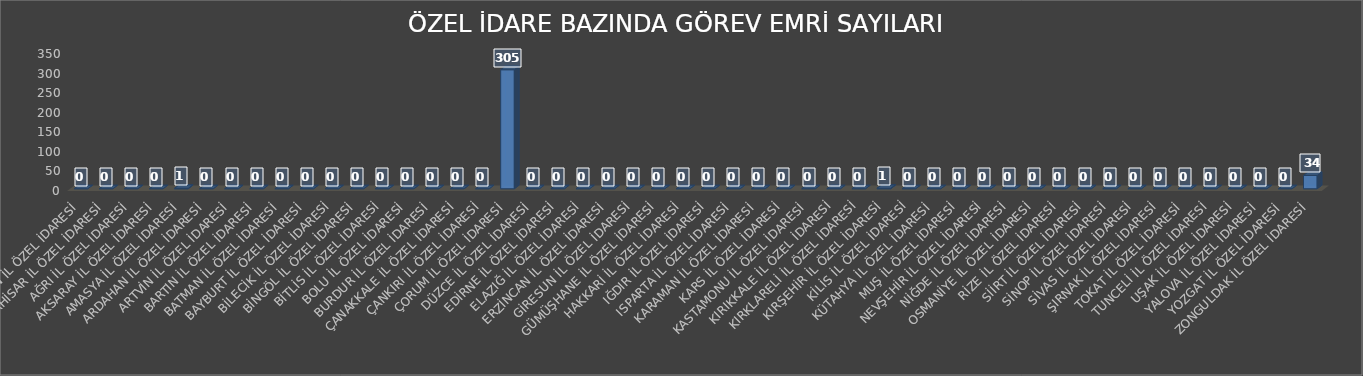
| Category | Series 0 |
|---|---|
| ADIYAMAN İL ÖZEL İDARESİ | 0 |
| AFYONKARAHİSAR İL ÖZEL İDARESİ | 0 |
| AĞRI İL ÖZEL İDARESİ | 0 |
| AKSARAY İL ÖZEL İDARESİ | 0 |
| AMASYA İL ÖZEL İDARESİ | 1 |
| ARDAHAN İL ÖZEL İDARESİ | 0 |
| ARTVİN İL ÖZEL İDARESİ | 0 |
| BARTIN İL ÖZEL İDARESİ | 0 |
| BATMAN İL ÖZEL İDARESİ | 0 |
| BAYBURT İL ÖZEL İDARESİ | 0 |
| BİLECİK İL ÖZEL İDARESİ | 0 |
| BİNGÖL İL ÖZEL İDARESİ | 0 |
| BİTLİS İL ÖZEL İDARESİ | 0 |
| BOLU İL ÖZEL İDARESİ | 0 |
| BURDUR İL ÖZEL İDARESİ | 0 |
| ÇANAKKALE İL ÖZEL İDARESİ | 0 |
| ÇANKIRI İL ÖZEL İDARESİ | 0 |
| ÇORUM İL ÖZEL İDARESİ | 305 |
| DÜZCE İL ÖZEL İDARESİ | 0 |
| EDİRNE İL ÖZEL İDARESİ | 0 |
| ELAZIĞ İL ÖZEL İDARESİ | 0 |
| ERZİNCAN İL ÖZEL İDARESİ | 0 |
| GİRESUN İL ÖZEL İDARESİ | 0 |
| GÜMÜŞHANE İL ÖZEL İDARESİ | 0 |
| HAKKARİ İL ÖZEL İDARESİ | 0 |
| IĞDIR İL ÖZEL İDARESİ | 0 |
| ISPARTA İL ÖZEL İDARESİ | 0 |
| KARAMAN İL ÖZEL İDARESİ | 0 |
| KARS İL ÖZEL İDARESİ | 0 |
| KASTAMONU İL ÖZEL İDARESİ | 0 |
| KIRIKKALE İL ÖZEL İDARESİ | 0 |
| KIRKLARELİ İL ÖZEL İDARESİ | 0 |
| KIRŞEHİR İL ÖZEL İDARESİ | 1 |
| KİLİS İL ÖZEL İDARESİ | 0 |
| KÜTAHYA İL ÖZEL İDARESİ | 0 |
| MUŞ İL ÖZEL İDARESİ | 0 |
| NEVŞEHİR İL ÖZEL İDARESİ | 0 |
| NİĞDE İL ÖZEL İDARESİ | 0 |
| OSMANİYE İL ÖZEL İDARESİ | 0 |
| RİZE İL ÖZEL İDARESİ | 0 |
| SİİRT İL ÖZEL İDARESİ | 0 |
| SİNOP İL ÖZEL İDARESİ | 0 |
| SİVAS İL ÖZEL İDARESİ | 0 |
| ŞIRNAK İL ÖZEL İDARESİ | 0 |
| TOKAT İL ÖZEL İDARESİ | 0 |
| TUNCELİ İL ÖZEL İDARESİ | 0 |
| UŞAK İL ÖZEL İDARESİ | 0 |
| YALOVA İL ÖZEL İDARESİ | 0 |
| YOZGAT İL ÖZEL İDARESİ | 0 |
| ZONGULDAK İL ÖZEL İDARESİ | 34 |